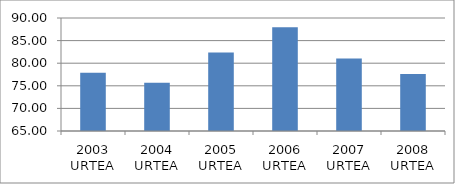
| Category | Series 0 |
|---|---|
| 2003 URTEA | 77.894 |
| 2004 URTEA | 75.697 |
| 2005 URTEA | 82.345 |
| 2006 URTEA | 87.942 |
| 2007 URTEA | 81.066 |
| 2008 URTEA | 77.635 |